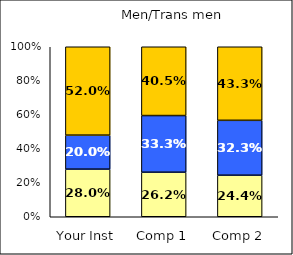
| Category | Low Respect | Average Respect | High Respect |
|---|---|---|---|
| Your Inst | 0.28 | 0.2 | 0.52 |
| Comp 1 | 0.262 | 0.333 | 0.405 |
| Comp 2 | 0.244 | 0.323 | 0.433 |